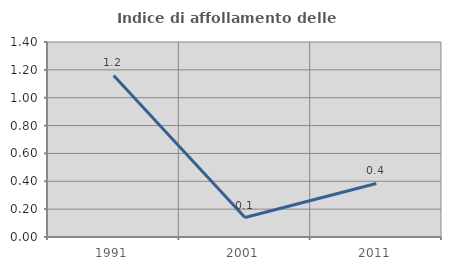
| Category | Indice di affollamento delle abitazioni  |
|---|---|
| 1991.0 | 1.16 |
| 2001.0 | 0.14 |
| 2011.0 | 0.384 |